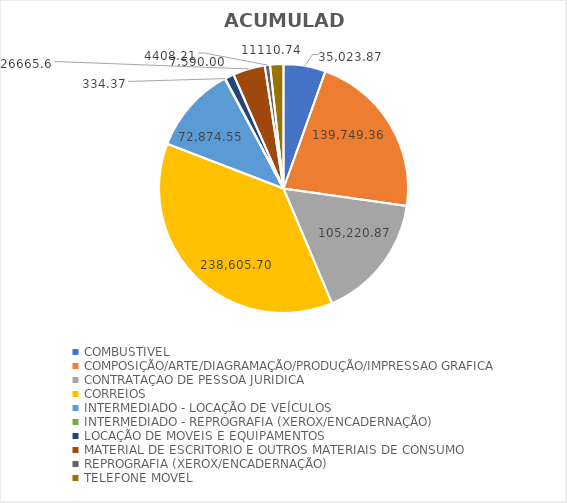
| Category | ACUMULADO |
|---|---|
| COMBUSTIVEL | 35023.87 |
| COMPOSIÇÃO/ARTE/DIAGRAMAÇÃO/PRODUÇÃO/IMPRESSAO GRAFICA | 139749.36 |
| CONTRATAÇAO DE PESSOA JURIDICA | 105220.87 |
| CORREIOS | 238605.7 |
| INTERMEDIADO - LOCAÇÃO DE VEÍCULOS | 72874.55 |
| INTERMEDIADO - REPROGRAFIA (XEROX/ENCADERNAÇÃO) | 334.37 |
| LOCAÇÃO DE MOVEIS E EQUIPAMENTOS | 7590 |
| MATERIAL DE ESCRITORIO E OUTROS MATERIAIS DE CONSUMO | 26665.6 |
| REPROGRAFIA (XEROX/ENCADERNAÇÃO) | 4408.21 |
| TELEFONE MOVEL | 11110.74 |